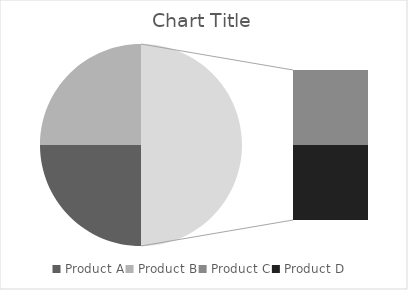
| Category | Series 6 | Series 7 | Series 8 | Series 9 | Series 10 | Series 11 | Series 3 | Series 4 | Series 5 | Series 0 | Series 1 | Series 2 |
|---|---|---|---|---|---|---|---|---|---|---|---|---|
| Product A | 100 | 200 | 300 | 100 | 200 | 300 | 100 | 200 | 300 | 100 | 200 | 300 |
| Product B | 100 | 200 | 300 | 100 | 200 | 300 | 100 | 200 | 300 | 100 | 200 | 300 |
| Product C | 100 | 200 | 300 | 100 | 200 | 300 | 100 | 200 | 300 | 100 | 200 | 300 |
| Product D | 100 | 200 | 300 | 100 | 200 | 300 | 100 | 200 | 300 | 100 | 200 | 300 |